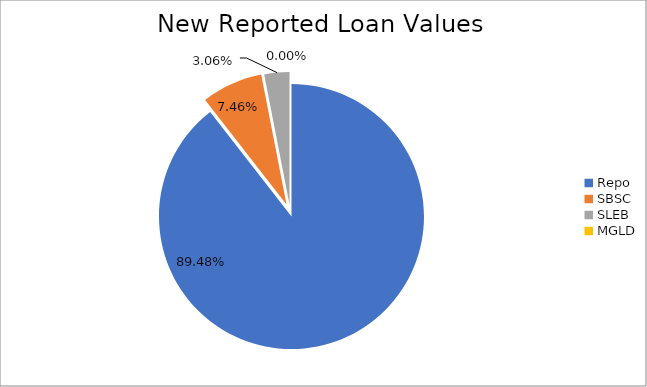
| Category | Series 0 |
|---|---|
| Repo | 12078149.514 |
| SBSC | 1007170.429 |
| SLEB | 412902.356 |
| MGLD | 176.305 |